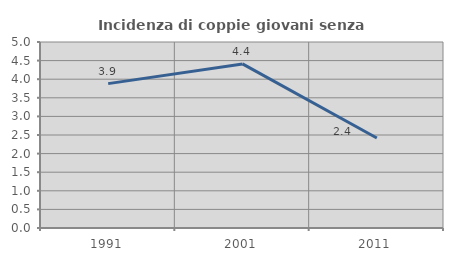
| Category | Incidenza di coppie giovani senza figli |
|---|---|
| 1991.0 | 3.881 |
| 2001.0 | 4.411 |
| 2011.0 | 2.418 |